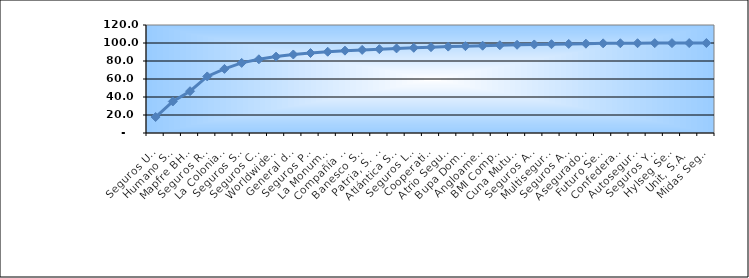
| Category | Series 0 |
|---|---|
| Seguros Universal, S. A. | 17.76 |
| Humano Seguros, S. A. | 35.04 |
| Mapfre BHD Compañía de Seguros | 46.412 |
| Seguros Reservas, S. A. | 62.86 |
| La Colonial, S. A., Compañia De Seguros | 71.218 |
| Seguros Sura, S.A. | 77.885 |
| Seguros Crecer, S. A. | 81.902 |
| Worldwide Seguros, S. A. | 84.878 |
| General de Seguros, S. A. | 87.243 |
| Seguros Pepín, S. A. | 88.862 |
| La Monumental de Seguros, S. A. | 90.283 |
| Compañía Dominicana de Seguros, C. por A. | 91.499 |
| Banesco Seguros | 92.333 |
| Patria, S. A., Compañía de Seguros | 93.142 |
| Atlántica Seguros, S. A. | 94.004 |
| Seguros La Internacional, S. A. | 94.66 |
| Cooperativa Nacional De Seguros, Inc  | 95.359 |
| Atrio Seguros S. A. | 95.979 |
| Bupa Dominicana, S. A. | 96.478 |
| Angloamericana de Seguros, S. A. | 97.011 |
| BMI Compañía de Seguros, S. A. | 97.518 |
| Cuna Mutual Insurance Society Dominicana | 98.027 |
| Seguros APS, S.R.L. | 98.397 |
| Multiseguros Su, S.A. | 98.656 |
| Seguros Ademi, S.A. | 98.948 |
| Aseguradora Agropecuaria Dominicana, S. A. | 99.243 |
| Futuro Seguros | 99.615 |
| Confederación del Canadá Dominicana, S. A. | 99.72 |
| Autoseguro, S. A. | 99.766 |
| Seguros Yunen, S.A. | 99.867 |
| Hylseg Seguros S.A | 99.875 |
| Unit, S.A. | 99.92 |
| Midas Seguros, S.A. | 100 |